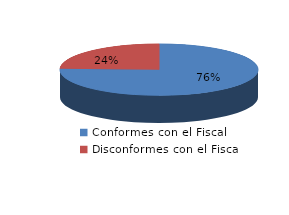
| Category | Series 0 |
|---|---|
| 0 | 853 |
| 1 | 275 |